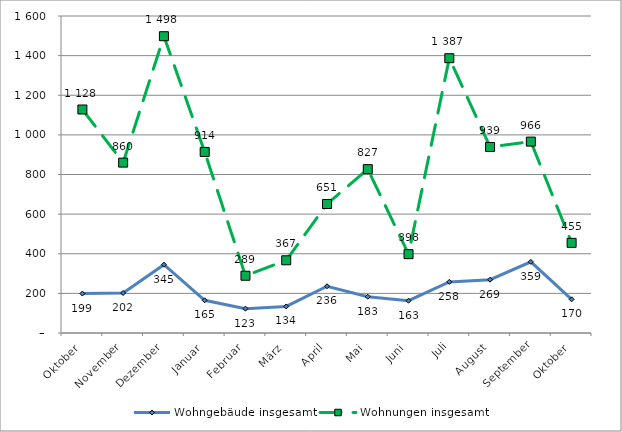
| Category | Wohngebäude insgesamt | Wohnungen insgesamt |
|---|---|---|
| Oktober | 199 | 1128 |
| November | 202 | 860 |
| Dezember | 345 | 1498 |
| Januar | 165 | 914 |
| Februar | 123 | 289 |
| März | 134 | 367 |
| April | 236 | 651 |
| Mai | 183 | 827 |
| Juni | 163 | 398 |
| Juli | 258 | 1387 |
| August | 269 | 939 |
| September | 359 | 966 |
| Oktober | 170 | 455 |